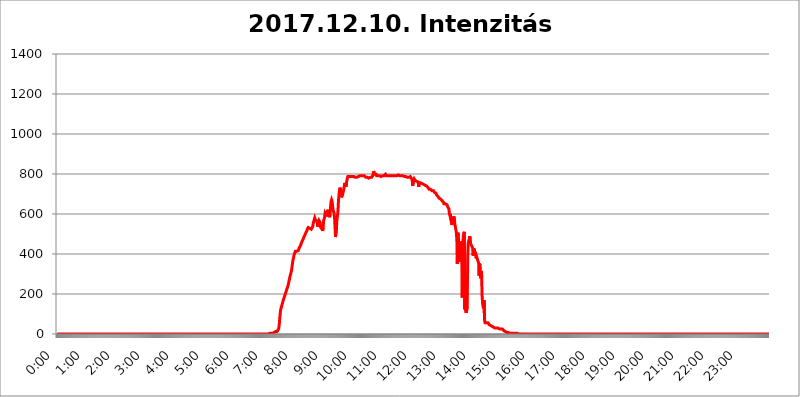
| Category | 2017.12.10. Intenzitás [W/m^2] |
|---|---|
| 0.0 | 0 |
| 0.0006944444444444445 | 0 |
| 0.001388888888888889 | 0 |
| 0.0020833333333333333 | 0 |
| 0.002777777777777778 | 0 |
| 0.003472222222222222 | 0 |
| 0.004166666666666667 | 0 |
| 0.004861111111111111 | 0 |
| 0.005555555555555556 | 0 |
| 0.0062499999999999995 | 0 |
| 0.006944444444444444 | 0 |
| 0.007638888888888889 | 0 |
| 0.008333333333333333 | 0 |
| 0.009027777777777779 | 0 |
| 0.009722222222222222 | 0 |
| 0.010416666666666666 | 0 |
| 0.011111111111111112 | 0 |
| 0.011805555555555555 | 0 |
| 0.012499999999999999 | 0 |
| 0.013194444444444444 | 0 |
| 0.013888888888888888 | 0 |
| 0.014583333333333332 | 0 |
| 0.015277777777777777 | 0 |
| 0.015972222222222224 | 0 |
| 0.016666666666666666 | 0 |
| 0.017361111111111112 | 0 |
| 0.018055555555555557 | 0 |
| 0.01875 | 0 |
| 0.019444444444444445 | 0 |
| 0.02013888888888889 | 0 |
| 0.020833333333333332 | 0 |
| 0.02152777777777778 | 0 |
| 0.022222222222222223 | 0 |
| 0.02291666666666667 | 0 |
| 0.02361111111111111 | 0 |
| 0.024305555555555556 | 0 |
| 0.024999999999999998 | 0 |
| 0.025694444444444447 | 0 |
| 0.02638888888888889 | 0 |
| 0.027083333333333334 | 0 |
| 0.027777777777777776 | 0 |
| 0.02847222222222222 | 0 |
| 0.029166666666666664 | 0 |
| 0.029861111111111113 | 0 |
| 0.030555555555555555 | 0 |
| 0.03125 | 0 |
| 0.03194444444444445 | 0 |
| 0.03263888888888889 | 0 |
| 0.03333333333333333 | 0 |
| 0.034027777777777775 | 0 |
| 0.034722222222222224 | 0 |
| 0.035416666666666666 | 0 |
| 0.036111111111111115 | 0 |
| 0.03680555555555556 | 0 |
| 0.0375 | 0 |
| 0.03819444444444444 | 0 |
| 0.03888888888888889 | 0 |
| 0.03958333333333333 | 0 |
| 0.04027777777777778 | 0 |
| 0.04097222222222222 | 0 |
| 0.041666666666666664 | 0 |
| 0.042361111111111106 | 0 |
| 0.04305555555555556 | 0 |
| 0.043750000000000004 | 0 |
| 0.044444444444444446 | 0 |
| 0.04513888888888889 | 0 |
| 0.04583333333333334 | 0 |
| 0.04652777777777778 | 0 |
| 0.04722222222222222 | 0 |
| 0.04791666666666666 | 0 |
| 0.04861111111111111 | 0 |
| 0.049305555555555554 | 0 |
| 0.049999999999999996 | 0 |
| 0.05069444444444445 | 0 |
| 0.051388888888888894 | 0 |
| 0.052083333333333336 | 0 |
| 0.05277777777777778 | 0 |
| 0.05347222222222222 | 0 |
| 0.05416666666666667 | 0 |
| 0.05486111111111111 | 0 |
| 0.05555555555555555 | 0 |
| 0.05625 | 0 |
| 0.05694444444444444 | 0 |
| 0.057638888888888885 | 0 |
| 0.05833333333333333 | 0 |
| 0.05902777777777778 | 0 |
| 0.059722222222222225 | 0 |
| 0.06041666666666667 | 0 |
| 0.061111111111111116 | 0 |
| 0.06180555555555556 | 0 |
| 0.0625 | 0 |
| 0.06319444444444444 | 0 |
| 0.06388888888888888 | 0 |
| 0.06458333333333334 | 0 |
| 0.06527777777777778 | 0 |
| 0.06597222222222222 | 0 |
| 0.06666666666666667 | 0 |
| 0.06736111111111111 | 0 |
| 0.06805555555555555 | 0 |
| 0.06874999999999999 | 0 |
| 0.06944444444444443 | 0 |
| 0.07013888888888889 | 0 |
| 0.07083333333333333 | 0 |
| 0.07152777777777779 | 0 |
| 0.07222222222222223 | 0 |
| 0.07291666666666667 | 0 |
| 0.07361111111111111 | 0 |
| 0.07430555555555556 | 0 |
| 0.075 | 0 |
| 0.07569444444444444 | 0 |
| 0.0763888888888889 | 0 |
| 0.07708333333333334 | 0 |
| 0.07777777777777778 | 0 |
| 0.07847222222222222 | 0 |
| 0.07916666666666666 | 0 |
| 0.0798611111111111 | 0 |
| 0.08055555555555556 | 0 |
| 0.08125 | 0 |
| 0.08194444444444444 | 0 |
| 0.08263888888888889 | 0 |
| 0.08333333333333333 | 0 |
| 0.08402777777777777 | 0 |
| 0.08472222222222221 | 0 |
| 0.08541666666666665 | 0 |
| 0.08611111111111112 | 0 |
| 0.08680555555555557 | 0 |
| 0.08750000000000001 | 0 |
| 0.08819444444444445 | 0 |
| 0.08888888888888889 | 0 |
| 0.08958333333333333 | 0 |
| 0.09027777777777778 | 0 |
| 0.09097222222222222 | 0 |
| 0.09166666666666667 | 0 |
| 0.09236111111111112 | 0 |
| 0.09305555555555556 | 0 |
| 0.09375 | 0 |
| 0.09444444444444444 | 0 |
| 0.09513888888888888 | 0 |
| 0.09583333333333333 | 0 |
| 0.09652777777777777 | 0 |
| 0.09722222222222222 | 0 |
| 0.09791666666666667 | 0 |
| 0.09861111111111111 | 0 |
| 0.09930555555555555 | 0 |
| 0.09999999999999999 | 0 |
| 0.10069444444444443 | 0 |
| 0.1013888888888889 | 0 |
| 0.10208333333333335 | 0 |
| 0.10277777777777779 | 0 |
| 0.10347222222222223 | 0 |
| 0.10416666666666667 | 0 |
| 0.10486111111111111 | 0 |
| 0.10555555555555556 | 0 |
| 0.10625 | 0 |
| 0.10694444444444444 | 0 |
| 0.1076388888888889 | 0 |
| 0.10833333333333334 | 0 |
| 0.10902777777777778 | 0 |
| 0.10972222222222222 | 0 |
| 0.1111111111111111 | 0 |
| 0.11180555555555556 | 0 |
| 0.11180555555555556 | 0 |
| 0.1125 | 0 |
| 0.11319444444444444 | 0 |
| 0.11388888888888889 | 0 |
| 0.11458333333333333 | 0 |
| 0.11527777777777777 | 0 |
| 0.11597222222222221 | 0 |
| 0.11666666666666665 | 0 |
| 0.1173611111111111 | 0 |
| 0.11805555555555557 | 0 |
| 0.11944444444444445 | 0 |
| 0.12013888888888889 | 0 |
| 0.12083333333333333 | 0 |
| 0.12152777777777778 | 0 |
| 0.12222222222222223 | 0 |
| 0.12291666666666667 | 0 |
| 0.12291666666666667 | 0 |
| 0.12361111111111112 | 0 |
| 0.12430555555555556 | 0 |
| 0.125 | 0 |
| 0.12569444444444444 | 0 |
| 0.12638888888888888 | 0 |
| 0.12708333333333333 | 0 |
| 0.16875 | 0 |
| 0.12847222222222224 | 0 |
| 0.12916666666666668 | 0 |
| 0.12986111111111112 | 0 |
| 0.13055555555555556 | 0 |
| 0.13125 | 0 |
| 0.13194444444444445 | 0 |
| 0.1326388888888889 | 0 |
| 0.13333333333333333 | 0 |
| 0.13402777777777777 | 0 |
| 0.13402777777777777 | 0 |
| 0.13472222222222222 | 0 |
| 0.13541666666666666 | 0 |
| 0.1361111111111111 | 0 |
| 0.13749999999999998 | 0 |
| 0.13819444444444443 | 0 |
| 0.1388888888888889 | 0 |
| 0.13958333333333334 | 0 |
| 0.14027777777777778 | 0 |
| 0.14097222222222222 | 0 |
| 0.14166666666666666 | 0 |
| 0.1423611111111111 | 0 |
| 0.14305555555555557 | 0 |
| 0.14375000000000002 | 0 |
| 0.14444444444444446 | 0 |
| 0.1451388888888889 | 0 |
| 0.1451388888888889 | 0 |
| 0.14652777777777778 | 0 |
| 0.14722222222222223 | 0 |
| 0.14791666666666667 | 0 |
| 0.1486111111111111 | 0 |
| 0.14930555555555555 | 0 |
| 0.15 | 0 |
| 0.15069444444444444 | 0 |
| 0.15138888888888888 | 0 |
| 0.15208333333333332 | 0 |
| 0.15277777777777776 | 0 |
| 0.15347222222222223 | 0 |
| 0.15416666666666667 | 0 |
| 0.15486111111111112 | 0 |
| 0.15555555555555556 | 0 |
| 0.15625 | 0 |
| 0.15694444444444444 | 0 |
| 0.15763888888888888 | 0 |
| 0.15833333333333333 | 0 |
| 0.15902777777777777 | 0 |
| 0.15972222222222224 | 0 |
| 0.16041666666666668 | 0 |
| 0.16111111111111112 | 0 |
| 0.16180555555555556 | 0 |
| 0.1625 | 0 |
| 0.16319444444444445 | 0 |
| 0.1638888888888889 | 0 |
| 0.16458333333333333 | 0 |
| 0.16527777777777777 | 0 |
| 0.16597222222222222 | 0 |
| 0.16666666666666666 | 0 |
| 0.1673611111111111 | 0 |
| 0.16805555555555554 | 0 |
| 0.16874999999999998 | 0 |
| 0.16944444444444443 | 0 |
| 0.17013888888888887 | 0 |
| 0.1708333333333333 | 0 |
| 0.17152777777777775 | 0 |
| 0.17222222222222225 | 0 |
| 0.1729166666666667 | 0 |
| 0.17361111111111113 | 0 |
| 0.17430555555555557 | 0 |
| 0.17500000000000002 | 0 |
| 0.17569444444444446 | 0 |
| 0.1763888888888889 | 0 |
| 0.17708333333333334 | 0 |
| 0.17777777777777778 | 0 |
| 0.17847222222222223 | 0 |
| 0.17916666666666667 | 0 |
| 0.1798611111111111 | 0 |
| 0.18055555555555555 | 0 |
| 0.18125 | 0 |
| 0.18194444444444444 | 0 |
| 0.1826388888888889 | 0 |
| 0.18333333333333335 | 0 |
| 0.1840277777777778 | 0 |
| 0.18472222222222223 | 0 |
| 0.18541666666666667 | 0 |
| 0.18611111111111112 | 0 |
| 0.18680555555555556 | 0 |
| 0.1875 | 0 |
| 0.18819444444444444 | 0 |
| 0.18888888888888888 | 0 |
| 0.18958333333333333 | 0 |
| 0.19027777777777777 | 0 |
| 0.1909722222222222 | 0 |
| 0.19166666666666665 | 0 |
| 0.19236111111111112 | 0 |
| 0.19305555555555554 | 0 |
| 0.19375 | 0 |
| 0.19444444444444445 | 0 |
| 0.1951388888888889 | 0 |
| 0.19583333333333333 | 0 |
| 0.19652777777777777 | 0 |
| 0.19722222222222222 | 0 |
| 0.19791666666666666 | 0 |
| 0.1986111111111111 | 0 |
| 0.19930555555555554 | 0 |
| 0.19999999999999998 | 0 |
| 0.20069444444444443 | 0 |
| 0.20138888888888887 | 0 |
| 0.2020833333333333 | 0 |
| 0.2027777777777778 | 0 |
| 0.2034722222222222 | 0 |
| 0.2041666666666667 | 0 |
| 0.20486111111111113 | 0 |
| 0.20555555555555557 | 0 |
| 0.20625000000000002 | 0 |
| 0.20694444444444446 | 0 |
| 0.2076388888888889 | 0 |
| 0.20833333333333334 | 0 |
| 0.20902777777777778 | 0 |
| 0.20972222222222223 | 0 |
| 0.21041666666666667 | 0 |
| 0.2111111111111111 | 0 |
| 0.21180555555555555 | 0 |
| 0.2125 | 0 |
| 0.21319444444444444 | 0 |
| 0.2138888888888889 | 0 |
| 0.21458333333333335 | 0 |
| 0.2152777777777778 | 0 |
| 0.21597222222222223 | 0 |
| 0.21666666666666667 | 0 |
| 0.21736111111111112 | 0 |
| 0.21805555555555556 | 0 |
| 0.21875 | 0 |
| 0.21944444444444444 | 0 |
| 0.22013888888888888 | 0 |
| 0.22083333333333333 | 0 |
| 0.22152777777777777 | 0 |
| 0.2222222222222222 | 0 |
| 0.22291666666666665 | 0 |
| 0.2236111111111111 | 0 |
| 0.22430555555555556 | 0 |
| 0.225 | 0 |
| 0.22569444444444445 | 0 |
| 0.2263888888888889 | 0 |
| 0.22708333333333333 | 0 |
| 0.22777777777777777 | 0 |
| 0.22847222222222222 | 0 |
| 0.22916666666666666 | 0 |
| 0.2298611111111111 | 0 |
| 0.23055555555555554 | 0 |
| 0.23124999999999998 | 0 |
| 0.23194444444444443 | 0 |
| 0.23263888888888887 | 0 |
| 0.2333333333333333 | 0 |
| 0.2340277777777778 | 0 |
| 0.2347222222222222 | 0 |
| 0.2354166666666667 | 0 |
| 0.23611111111111113 | 0 |
| 0.23680555555555557 | 0 |
| 0.23750000000000002 | 0 |
| 0.23819444444444446 | 0 |
| 0.2388888888888889 | 0 |
| 0.23958333333333334 | 0 |
| 0.24027777777777778 | 0 |
| 0.24097222222222223 | 0 |
| 0.24166666666666667 | 0 |
| 0.2423611111111111 | 0 |
| 0.24305555555555555 | 0 |
| 0.24375 | 0 |
| 0.24444444444444446 | 0 |
| 0.24513888888888888 | 0 |
| 0.24583333333333335 | 0 |
| 0.2465277777777778 | 0 |
| 0.24722222222222223 | 0 |
| 0.24791666666666667 | 0 |
| 0.24861111111111112 | 0 |
| 0.24930555555555556 | 0 |
| 0.25 | 0 |
| 0.25069444444444444 | 0 |
| 0.2513888888888889 | 0 |
| 0.2520833333333333 | 0 |
| 0.25277777777777777 | 0 |
| 0.2534722222222222 | 0 |
| 0.25416666666666665 | 0 |
| 0.2548611111111111 | 0 |
| 0.2555555555555556 | 0 |
| 0.25625000000000003 | 0 |
| 0.2569444444444445 | 0 |
| 0.2576388888888889 | 0 |
| 0.25833333333333336 | 0 |
| 0.2590277777777778 | 0 |
| 0.25972222222222224 | 0 |
| 0.2604166666666667 | 0 |
| 0.2611111111111111 | 0 |
| 0.26180555555555557 | 0 |
| 0.2625 | 0 |
| 0.26319444444444445 | 0 |
| 0.2638888888888889 | 0 |
| 0.26458333333333334 | 0 |
| 0.2652777777777778 | 0 |
| 0.2659722222222222 | 0 |
| 0.26666666666666666 | 0 |
| 0.2673611111111111 | 0 |
| 0.26805555555555555 | 0 |
| 0.26875 | 0 |
| 0.26944444444444443 | 0 |
| 0.2701388888888889 | 0 |
| 0.2708333333333333 | 0 |
| 0.27152777777777776 | 0 |
| 0.2722222222222222 | 0 |
| 0.27291666666666664 | 0 |
| 0.2736111111111111 | 0 |
| 0.2743055555555555 | 0 |
| 0.27499999999999997 | 0 |
| 0.27569444444444446 | 0 |
| 0.27638888888888885 | 0 |
| 0.27708333333333335 | 0 |
| 0.2777777777777778 | 0 |
| 0.27847222222222223 | 0 |
| 0.2791666666666667 | 0 |
| 0.2798611111111111 | 0 |
| 0.28055555555555556 | 0 |
| 0.28125 | 0 |
| 0.28194444444444444 | 0 |
| 0.2826388888888889 | 0 |
| 0.2833333333333333 | 0 |
| 0.28402777777777777 | 0 |
| 0.2847222222222222 | 0 |
| 0.28541666666666665 | 0 |
| 0.28611111111111115 | 0 |
| 0.28680555555555554 | 0 |
| 0.28750000000000003 | 0 |
| 0.2881944444444445 | 0 |
| 0.2888888888888889 | 0 |
| 0.28958333333333336 | 0 |
| 0.2902777777777778 | 0 |
| 0.29097222222222224 | 0 |
| 0.2916666666666667 | 0 |
| 0.2923611111111111 | 0 |
| 0.29305555555555557 | 0 |
| 0.29375 | 0 |
| 0.29444444444444445 | 0 |
| 0.2951388888888889 | 0 |
| 0.29583333333333334 | 0 |
| 0.2965277777777778 | 0 |
| 0.2972222222222222 | 0 |
| 0.29791666666666666 | 3.525 |
| 0.2986111111111111 | 3.525 |
| 0.29930555555555555 | 3.525 |
| 0.3 | 3.525 |
| 0.30069444444444443 | 3.525 |
| 0.3013888888888889 | 3.525 |
| 0.3020833333333333 | 3.525 |
| 0.30277777777777776 | 7.887 |
| 0.3034722222222222 | 7.887 |
| 0.30416666666666664 | 7.887 |
| 0.3048611111111111 | 7.887 |
| 0.3055555555555555 | 7.887 |
| 0.30624999999999997 | 12.257 |
| 0.3069444444444444 | 12.257 |
| 0.3076388888888889 | 12.257 |
| 0.30833333333333335 | 12.257 |
| 0.3090277777777778 | 16.636 |
| 0.30972222222222223 | 16.636 |
| 0.3104166666666667 | 25.419 |
| 0.3111111111111111 | 38.653 |
| 0.31180555555555556 | 65.31 |
| 0.3125 | 96.682 |
| 0.31319444444444444 | 119.235 |
| 0.3138888888888889 | 128.284 |
| 0.3145833333333333 | 137.347 |
| 0.31527777777777777 | 146.423 |
| 0.3159722222222222 | 155.509 |
| 0.31666666666666665 | 164.605 |
| 0.31736111111111115 | 173.709 |
| 0.31805555555555554 | 178.264 |
| 0.31875000000000003 | 187.378 |
| 0.3194444444444445 | 196.497 |
| 0.3201388888888889 | 201.058 |
| 0.32083333333333336 | 210.182 |
| 0.3215277777777778 | 219.309 |
| 0.32222222222222224 | 223.873 |
| 0.3229166666666667 | 233 |
| 0.3236111111111111 | 242.127 |
| 0.32430555555555557 | 251.251 |
| 0.325 | 264.932 |
| 0.32569444444444445 | 274.047 |
| 0.3263888888888889 | 287.709 |
| 0.32708333333333334 | 296.808 |
| 0.3277777777777778 | 305.898 |
| 0.3284722222222222 | 314.98 |
| 0.32916666666666666 | 333.113 |
| 0.3298611111111111 | 351.198 |
| 0.33055555555555555 | 369.23 |
| 0.33125 | 378.224 |
| 0.33194444444444443 | 391.685 |
| 0.3326388888888889 | 400.638 |
| 0.3333333333333333 | 405.108 |
| 0.3340277777777778 | 414.035 |
| 0.3347222222222222 | 414.035 |
| 0.3354166666666667 | 418.492 |
| 0.3361111111111111 | 414.035 |
| 0.3368055555555556 | 409.574 |
| 0.33749999999999997 | 414.035 |
| 0.33819444444444446 | 418.492 |
| 0.33888888888888885 | 422.943 |
| 0.33958333333333335 | 431.833 |
| 0.34027777777777773 | 436.27 |
| 0.34097222222222223 | 440.702 |
| 0.3416666666666666 | 445.129 |
| 0.3423611111111111 | 453.968 |
| 0.3430555555555555 | 458.38 |
| 0.34375 | 467.187 |
| 0.3444444444444445 | 471.582 |
| 0.3451388888888889 | 475.972 |
| 0.3458333333333334 | 484.735 |
| 0.34652777777777777 | 489.108 |
| 0.34722222222222227 | 493.475 |
| 0.34791666666666665 | 497.836 |
| 0.34861111111111115 | 506.542 |
| 0.34930555555555554 | 510.885 |
| 0.35000000000000003 | 515.223 |
| 0.3506944444444444 | 523.88 |
| 0.3513888888888889 | 528.2 |
| 0.3520833333333333 | 532.513 |
| 0.3527777777777778 | 532.513 |
| 0.3534722222222222 | 528.2 |
| 0.3541666666666667 | 528.2 |
| 0.3548611111111111 | 528.2 |
| 0.35555555555555557 | 523.88 |
| 0.35625 | 523.88 |
| 0.35694444444444445 | 523.88 |
| 0.3576388888888889 | 519.555 |
| 0.35833333333333334 | 536.82 |
| 0.3590277777777778 | 553.986 |
| 0.3597222222222222 | 558.261 |
| 0.36041666666666666 | 571.049 |
| 0.3611111111111111 | 579.542 |
| 0.36180555555555555 | 571.049 |
| 0.3625 | 566.793 |
| 0.36319444444444443 | 571.049 |
| 0.3638888888888889 | 566.793 |
| 0.3645833333333333 | 553.986 |
| 0.3652777777777778 | 536.82 |
| 0.3659722222222222 | 532.513 |
| 0.3666666666666667 | 541.121 |
| 0.3673611111111111 | 566.793 |
| 0.3680555555555556 | 571.049 |
| 0.36874999999999997 | 558.261 |
| 0.36944444444444446 | 532.513 |
| 0.37013888888888885 | 528.2 |
| 0.37083333333333335 | 536.82 |
| 0.37152777777777773 | 523.88 |
| 0.37222222222222223 | 515.223 |
| 0.3729166666666666 | 532.513 |
| 0.3736111111111111 | 566.793 |
| 0.3743055555555555 | 575.299 |
| 0.375 | 583.779 |
| 0.3756944444444445 | 604.864 |
| 0.3763888888888889 | 604.864 |
| 0.3770833333333334 | 596.45 |
| 0.37777777777777777 | 588.009 |
| 0.37847222222222227 | 592.233 |
| 0.37916666666666665 | 613.252 |
| 0.37986111111111115 | 621.613 |
| 0.38055555555555554 | 604.864 |
| 0.38125000000000003 | 592.233 |
| 0.3819444444444444 | 583.779 |
| 0.3826388888888889 | 596.45 |
| 0.3833333333333333 | 634.105 |
| 0.3840277777777778 | 663.019 |
| 0.3847222222222222 | 671.22 |
| 0.3854166666666667 | 663.019 |
| 0.3861111111111111 | 642.4 |
| 0.38680555555555557 | 621.613 |
| 0.3875 | 613.252 |
| 0.38819444444444445 | 604.864 |
| 0.3888888888888889 | 583.779 |
| 0.38958333333333334 | 536.82 |
| 0.3902777777777778 | 484.735 |
| 0.3909722222222222 | 489.108 |
| 0.39166666666666666 | 532.513 |
| 0.3923611111111111 | 575.299 |
| 0.39305555555555555 | 592.233 |
| 0.39375 | 617.436 |
| 0.39444444444444443 | 667.123 |
| 0.3951388888888889 | 695.666 |
| 0.3958333333333333 | 719.877 |
| 0.3965277777777778 | 731.896 |
| 0.3972222222222222 | 723.889 |
| 0.3979166666666667 | 707.8 |
| 0.3986111111111111 | 683.473 |
| 0.3993055555555556 | 683.473 |
| 0.39999999999999997 | 695.666 |
| 0.40069444444444446 | 703.762 |
| 0.40138888888888885 | 715.858 |
| 0.40208333333333335 | 727.896 |
| 0.40277777777777773 | 743.859 |
| 0.40347222222222223 | 755.766 |
| 0.4041666666666666 | 743.859 |
| 0.4048611111111111 | 735.89 |
| 0.4055555555555555 | 755.766 |
| 0.40625 | 767.62 |
| 0.4069444444444445 | 779.42 |
| 0.4076388888888889 | 787.258 |
| 0.4083333333333334 | 787.258 |
| 0.40902777777777777 | 787.258 |
| 0.40972222222222227 | 787.258 |
| 0.41041666666666665 | 787.258 |
| 0.41111111111111115 | 787.258 |
| 0.41180555555555554 | 787.258 |
| 0.41250000000000003 | 787.258 |
| 0.4131944444444444 | 787.258 |
| 0.4138888888888889 | 787.258 |
| 0.4145833333333333 | 787.258 |
| 0.4152777777777778 | 787.258 |
| 0.4159722222222222 | 787.258 |
| 0.4166666666666667 | 783.342 |
| 0.4173611111111111 | 783.342 |
| 0.41805555555555557 | 783.342 |
| 0.41875 | 787.258 |
| 0.41944444444444445 | 787.258 |
| 0.4201388888888889 | 783.342 |
| 0.42083333333333334 | 783.342 |
| 0.4215277777777778 | 787.258 |
| 0.4222222222222222 | 787.258 |
| 0.42291666666666666 | 787.258 |
| 0.4236111111111111 | 791.169 |
| 0.42430555555555555 | 791.169 |
| 0.425 | 791.169 |
| 0.42569444444444443 | 791.169 |
| 0.4263888888888889 | 791.169 |
| 0.4270833333333333 | 791.169 |
| 0.4277777777777778 | 791.169 |
| 0.4284722222222222 | 791.169 |
| 0.4291666666666667 | 791.169 |
| 0.4298611111111111 | 787.258 |
| 0.4305555555555556 | 791.169 |
| 0.43124999999999997 | 787.258 |
| 0.43194444444444446 | 787.258 |
| 0.43263888888888885 | 783.342 |
| 0.43333333333333335 | 783.342 |
| 0.43402777777777773 | 779.42 |
| 0.43472222222222223 | 783.342 |
| 0.4354166666666666 | 783.342 |
| 0.4361111111111111 | 779.42 |
| 0.4368055555555555 | 779.42 |
| 0.4375 | 783.342 |
| 0.4381944444444445 | 783.342 |
| 0.4388888888888889 | 783.342 |
| 0.4395833333333334 | 779.42 |
| 0.44027777777777777 | 783.342 |
| 0.44097222222222227 | 783.342 |
| 0.44166666666666665 | 787.258 |
| 0.44236111111111115 | 791.169 |
| 0.44305555555555554 | 798.974 |
| 0.44375000000000003 | 814.519 |
| 0.4444444444444444 | 806.757 |
| 0.4451388888888889 | 798.974 |
| 0.4458333333333333 | 795.074 |
| 0.4465277777777778 | 795.074 |
| 0.4472222222222222 | 798.974 |
| 0.4479166666666667 | 791.169 |
| 0.4486111111111111 | 791.169 |
| 0.44930555555555557 | 795.074 |
| 0.45 | 791.169 |
| 0.45069444444444445 | 791.169 |
| 0.4513888888888889 | 787.258 |
| 0.45208333333333334 | 791.169 |
| 0.4527777777777778 | 791.169 |
| 0.4534722222222222 | 791.169 |
| 0.45416666666666666 | 787.258 |
| 0.4548611111111111 | 791.169 |
| 0.45555555555555555 | 791.169 |
| 0.45625 | 791.169 |
| 0.45694444444444443 | 795.074 |
| 0.4576388888888889 | 791.169 |
| 0.4583333333333333 | 791.169 |
| 0.4590277777777778 | 791.169 |
| 0.4597222222222222 | 795.074 |
| 0.4604166666666667 | 798.974 |
| 0.4611111111111111 | 795.074 |
| 0.4618055555555556 | 791.169 |
| 0.46249999999999997 | 791.169 |
| 0.46319444444444446 | 791.169 |
| 0.46388888888888885 | 791.169 |
| 0.46458333333333335 | 787.258 |
| 0.46527777777777773 | 791.169 |
| 0.46597222222222223 | 791.169 |
| 0.4666666666666666 | 795.074 |
| 0.4673611111111111 | 791.169 |
| 0.4680555555555555 | 791.169 |
| 0.46875 | 791.169 |
| 0.4694444444444445 | 791.169 |
| 0.4701388888888889 | 791.169 |
| 0.4708333333333334 | 791.169 |
| 0.47152777777777777 | 791.169 |
| 0.47222222222222227 | 791.169 |
| 0.47291666666666665 | 791.169 |
| 0.47361111111111115 | 791.169 |
| 0.47430555555555554 | 791.169 |
| 0.47500000000000003 | 791.169 |
| 0.4756944444444444 | 791.169 |
| 0.4763888888888889 | 791.169 |
| 0.4770833333333333 | 791.169 |
| 0.4777777777777778 | 795.074 |
| 0.4784722222222222 | 795.074 |
| 0.4791666666666667 | 791.169 |
| 0.4798611111111111 | 791.169 |
| 0.48055555555555557 | 791.169 |
| 0.48125 | 791.169 |
| 0.48194444444444445 | 791.169 |
| 0.4826388888888889 | 791.169 |
| 0.48333333333333334 | 791.169 |
| 0.4840277777777778 | 791.169 |
| 0.4847222222222222 | 791.169 |
| 0.48541666666666666 | 791.169 |
| 0.4861111111111111 | 791.169 |
| 0.48680555555555555 | 787.258 |
| 0.4875 | 787.258 |
| 0.48819444444444443 | 787.258 |
| 0.4888888888888889 | 787.258 |
| 0.4895833333333333 | 787.258 |
| 0.4902777777777778 | 783.342 |
| 0.4909722222222222 | 783.342 |
| 0.4916666666666667 | 783.342 |
| 0.4923611111111111 | 783.342 |
| 0.4930555555555556 | 783.342 |
| 0.49374999999999997 | 783.342 |
| 0.49444444444444446 | 783.342 |
| 0.49513888888888885 | 787.258 |
| 0.49583333333333335 | 787.258 |
| 0.49652777777777773 | 779.42 |
| 0.49722222222222223 | 779.42 |
| 0.4979166666666666 | 767.62 |
| 0.4986111111111111 | 739.877 |
| 0.4993055555555555 | 775.492 |
| 0.5 | 767.62 |
| 0.5006944444444444 | 775.492 |
| 0.5013888888888889 | 775.492 |
| 0.5020833333333333 | 767.62 |
| 0.5027777777777778 | 767.62 |
| 0.5034722222222222 | 767.62 |
| 0.5041666666666667 | 763.674 |
| 0.5048611111111111 | 759.723 |
| 0.5055555555555555 | 759.723 |
| 0.50625 | 759.723 |
| 0.5069444444444444 | 735.89 |
| 0.5076388888888889 | 755.766 |
| 0.5083333333333333 | 759.723 |
| 0.5090277777777777 | 755.766 |
| 0.5097222222222222 | 755.766 |
| 0.5104166666666666 | 755.766 |
| 0.5111111111111112 | 755.766 |
| 0.5118055555555555 | 751.803 |
| 0.5125000000000001 | 751.803 |
| 0.5131944444444444 | 747.834 |
| 0.513888888888889 | 747.834 |
| 0.5145833333333333 | 747.834 |
| 0.5152777777777778 | 747.834 |
| 0.5159722222222222 | 743.859 |
| 0.5166666666666667 | 743.859 |
| 0.517361111111111 | 739.877 |
| 0.5180555555555556 | 739.877 |
| 0.5187499999999999 | 735.89 |
| 0.5194444444444445 | 735.89 |
| 0.5201388888888888 | 731.896 |
| 0.5208333333333334 | 731.896 |
| 0.5215277777777778 | 723.889 |
| 0.5222222222222223 | 723.889 |
| 0.5229166666666667 | 727.896 |
| 0.5236111111111111 | 723.889 |
| 0.5243055555555556 | 719.877 |
| 0.525 | 719.877 |
| 0.5256944444444445 | 715.858 |
| 0.5263888888888889 | 715.858 |
| 0.5270833333333333 | 715.858 |
| 0.5277777777777778 | 715.858 |
| 0.5284722222222222 | 711.832 |
| 0.5291666666666667 | 707.8 |
| 0.5298611111111111 | 703.762 |
| 0.5305555555555556 | 703.762 |
| 0.53125 | 703.762 |
| 0.5319444444444444 | 695.666 |
| 0.5326388888888889 | 695.666 |
| 0.5333333333333333 | 691.608 |
| 0.5340277777777778 | 687.544 |
| 0.5347222222222222 | 683.473 |
| 0.5354166666666667 | 679.395 |
| 0.5361111111111111 | 679.395 |
| 0.5368055555555555 | 675.311 |
| 0.5375 | 675.311 |
| 0.5381944444444444 | 671.22 |
| 0.5388888888888889 | 671.22 |
| 0.5395833333333333 | 667.123 |
| 0.5402777777777777 | 667.123 |
| 0.5409722222222222 | 663.019 |
| 0.5416666666666666 | 658.909 |
| 0.5423611111111112 | 650.667 |
| 0.5430555555555555 | 650.667 |
| 0.5437500000000001 | 650.667 |
| 0.5444444444444444 | 650.667 |
| 0.545138888888889 | 650.667 |
| 0.5458333333333333 | 646.537 |
| 0.5465277777777778 | 646.537 |
| 0.5472222222222222 | 642.4 |
| 0.5479166666666667 | 634.105 |
| 0.548611111111111 | 634.105 |
| 0.5493055555555556 | 625.784 |
| 0.5499999999999999 | 600.661 |
| 0.5506944444444445 | 592.233 |
| 0.5513888888888888 | 600.661 |
| 0.5520833333333334 | 575.299 |
| 0.5527777777777778 | 558.261 |
| 0.5534722222222223 | 545.416 |
| 0.5541666666666667 | 549.704 |
| 0.5548611111111111 | 566.793 |
| 0.5555555555555556 | 579.542 |
| 0.55625 | 588.009 |
| 0.5569444444444445 | 575.299 |
| 0.5576388888888889 | 549.704 |
| 0.5583333333333333 | 536.82 |
| 0.5590277777777778 | 541.121 |
| 0.5597222222222222 | 506.542 |
| 0.5604166666666667 | 475.972 |
| 0.5611111111111111 | 351.198 |
| 0.5618055555555556 | 506.542 |
| 0.5625 | 489.108 |
| 0.5631944444444444 | 440.702 |
| 0.5638888888888889 | 387.202 |
| 0.5645833333333333 | 360.221 |
| 0.5652777777777778 | 391.685 |
| 0.5659722222222222 | 391.685 |
| 0.5666666666666667 | 462.786 |
| 0.5673611111111111 | 391.685 |
| 0.5680555555555555 | 182.82 |
| 0.56875 | 422.943 |
| 0.5694444444444444 | 489.108 |
| 0.5701388888888889 | 502.192 |
| 0.5708333333333333 | 510.885 |
| 0.5715277777777777 | 123.758 |
| 0.5722222222222222 | 205.62 |
| 0.5729166666666666 | 114.716 |
| 0.5736111111111112 | 105.69 |
| 0.5743055555555555 | 101.184 |
| 0.5750000000000001 | 137.347 |
| 0.5756944444444444 | 387.202 |
| 0.576388888888889 | 453.968 |
| 0.5770833333333333 | 458.38 |
| 0.5777777777777778 | 475.972 |
| 0.5784722222222222 | 489.108 |
| 0.5791666666666667 | 475.972 |
| 0.579861111111111 | 449.551 |
| 0.5805555555555556 | 445.129 |
| 0.5812499999999999 | 445.129 |
| 0.5819444444444445 | 436.27 |
| 0.5826388888888888 | 427.39 |
| 0.5833333333333334 | 391.685 |
| 0.5840277777777778 | 427.39 |
| 0.5847222222222223 | 422.943 |
| 0.5854166666666667 | 414.035 |
| 0.5861111111111111 | 409.574 |
| 0.5868055555555556 | 396.164 |
| 0.5875 | 378.224 |
| 0.5881944444444445 | 387.202 |
| 0.5888888888888889 | 378.224 |
| 0.5895833333333333 | 382.715 |
| 0.5902777777777778 | 373.729 |
| 0.5909722222222222 | 355.712 |
| 0.5916666666666667 | 292.259 |
| 0.5923611111111111 | 351.198 |
| 0.5930555555555556 | 342.162 |
| 0.59375 | 278.603 |
| 0.5944444444444444 | 314.98 |
| 0.5951388888888889 | 305.898 |
| 0.5958333333333333 | 191.937 |
| 0.5965277777777778 | 155.509 |
| 0.5972222222222222 | 137.347 |
| 0.5979166666666667 | 128.284 |
| 0.5986111111111111 | 169.156 |
| 0.5993055555555555 | 69.775 |
| 0.6 | 56.398 |
| 0.6006944444444444 | 56.398 |
| 0.6013888888888889 | 56.398 |
| 0.6020833333333333 | 56.398 |
| 0.6027777777777777 | 60.85 |
| 0.6034722222222222 | 56.398 |
| 0.6041666666666666 | 56.398 |
| 0.6048611111111112 | 51.951 |
| 0.6055555555555555 | 47.511 |
| 0.6062500000000001 | 47.511 |
| 0.6069444444444444 | 47.511 |
| 0.607638888888889 | 43.079 |
| 0.6083333333333333 | 43.079 |
| 0.6090277777777778 | 38.653 |
| 0.6097222222222222 | 38.653 |
| 0.6104166666666667 | 38.653 |
| 0.611111111111111 | 34.234 |
| 0.6118055555555556 | 34.234 |
| 0.6124999999999999 | 34.234 |
| 0.6131944444444445 | 34.234 |
| 0.6138888888888888 | 29.823 |
| 0.6145833333333334 | 29.823 |
| 0.6152777777777778 | 29.823 |
| 0.6159722222222223 | 29.823 |
| 0.6166666666666667 | 29.823 |
| 0.6173611111111111 | 29.823 |
| 0.6180555555555556 | 29.823 |
| 0.61875 | 25.419 |
| 0.6194444444444445 | 25.419 |
| 0.6201388888888889 | 25.419 |
| 0.6208333333333333 | 25.419 |
| 0.6215277777777778 | 25.419 |
| 0.6222222222222222 | 25.419 |
| 0.6229166666666667 | 25.419 |
| 0.6236111111111111 | 25.419 |
| 0.6243055555555556 | 25.419 |
| 0.625 | 21.024 |
| 0.6256944444444444 | 21.024 |
| 0.6263888888888889 | 16.636 |
| 0.6270833333333333 | 12.257 |
| 0.6277777777777778 | 12.257 |
| 0.6284722222222222 | 12.257 |
| 0.6291666666666667 | 12.257 |
| 0.6298611111111111 | 12.257 |
| 0.6305555555555555 | 7.887 |
| 0.63125 | 7.887 |
| 0.6319444444444444 | 7.887 |
| 0.6326388888888889 | 7.887 |
| 0.6333333333333333 | 3.525 |
| 0.6340277777777777 | 3.525 |
| 0.6347222222222222 | 3.525 |
| 0.6354166666666666 | 3.525 |
| 0.6361111111111112 | 3.525 |
| 0.6368055555555555 | 3.525 |
| 0.6375000000000001 | 3.525 |
| 0.6381944444444444 | 3.525 |
| 0.638888888888889 | 3.525 |
| 0.6395833333333333 | 7.887 |
| 0.6402777777777778 | 3.525 |
| 0.6409722222222222 | 3.525 |
| 0.6416666666666667 | 3.525 |
| 0.642361111111111 | 3.525 |
| 0.6430555555555556 | 3.525 |
| 0.6437499999999999 | 3.525 |
| 0.6444444444444445 | 3.525 |
| 0.6451388888888888 | 3.525 |
| 0.6458333333333334 | 0 |
| 0.6465277777777778 | 0 |
| 0.6472222222222223 | 0 |
| 0.6479166666666667 | 0 |
| 0.6486111111111111 | 0 |
| 0.6493055555555556 | 0 |
| 0.65 | 0 |
| 0.6506944444444445 | 0 |
| 0.6513888888888889 | 0 |
| 0.6520833333333333 | 0 |
| 0.6527777777777778 | 0 |
| 0.6534722222222222 | 0 |
| 0.6541666666666667 | 0 |
| 0.6548611111111111 | 0 |
| 0.6555555555555556 | 0 |
| 0.65625 | 0 |
| 0.6569444444444444 | 0 |
| 0.6576388888888889 | 0 |
| 0.6583333333333333 | 0 |
| 0.6590277777777778 | 0 |
| 0.6597222222222222 | 0 |
| 0.6604166666666667 | 0 |
| 0.6611111111111111 | 0 |
| 0.6618055555555555 | 0 |
| 0.6625 | 0 |
| 0.6631944444444444 | 0 |
| 0.6638888888888889 | 0 |
| 0.6645833333333333 | 0 |
| 0.6652777777777777 | 0 |
| 0.6659722222222222 | 0 |
| 0.6666666666666666 | 0 |
| 0.6673611111111111 | 0 |
| 0.6680555555555556 | 0 |
| 0.6687500000000001 | 0 |
| 0.6694444444444444 | 0 |
| 0.6701388888888888 | 0 |
| 0.6708333333333334 | 0 |
| 0.6715277777777778 | 0 |
| 0.6722222222222222 | 0 |
| 0.6729166666666666 | 0 |
| 0.6736111111111112 | 0 |
| 0.6743055555555556 | 0 |
| 0.6749999999999999 | 0 |
| 0.6756944444444444 | 0 |
| 0.6763888888888889 | 0 |
| 0.6770833333333334 | 0 |
| 0.6777777777777777 | 0 |
| 0.6784722222222223 | 0 |
| 0.6791666666666667 | 0 |
| 0.6798611111111111 | 0 |
| 0.6805555555555555 | 0 |
| 0.68125 | 0 |
| 0.6819444444444445 | 0 |
| 0.6826388888888889 | 0 |
| 0.6833333333333332 | 0 |
| 0.6840277777777778 | 0 |
| 0.6847222222222222 | 0 |
| 0.6854166666666667 | 0 |
| 0.686111111111111 | 0 |
| 0.6868055555555556 | 0 |
| 0.6875 | 0 |
| 0.6881944444444444 | 0 |
| 0.688888888888889 | 0 |
| 0.6895833333333333 | 0 |
| 0.6902777777777778 | 0 |
| 0.6909722222222222 | 0 |
| 0.6916666666666668 | 0 |
| 0.6923611111111111 | 0 |
| 0.6930555555555555 | 0 |
| 0.69375 | 0 |
| 0.6944444444444445 | 0 |
| 0.6951388888888889 | 0 |
| 0.6958333333333333 | 0 |
| 0.6965277777777777 | 0 |
| 0.6972222222222223 | 0 |
| 0.6979166666666666 | 0 |
| 0.6986111111111111 | 0 |
| 0.6993055555555556 | 0 |
| 0.7000000000000001 | 0 |
| 0.7006944444444444 | 0 |
| 0.7013888888888888 | 0 |
| 0.7020833333333334 | 0 |
| 0.7027777777777778 | 0 |
| 0.7034722222222222 | 0 |
| 0.7041666666666666 | 0 |
| 0.7048611111111112 | 0 |
| 0.7055555555555556 | 0 |
| 0.7062499999999999 | 0 |
| 0.7069444444444444 | 0 |
| 0.7076388888888889 | 0 |
| 0.7083333333333334 | 0 |
| 0.7090277777777777 | 0 |
| 0.7097222222222223 | 0 |
| 0.7104166666666667 | 0 |
| 0.7111111111111111 | 0 |
| 0.7118055555555555 | 0 |
| 0.7125 | 0 |
| 0.7131944444444445 | 0 |
| 0.7138888888888889 | 0 |
| 0.7145833333333332 | 0 |
| 0.7152777777777778 | 0 |
| 0.7159722222222222 | 0 |
| 0.7166666666666667 | 0 |
| 0.717361111111111 | 0 |
| 0.7180555555555556 | 0 |
| 0.71875 | 0 |
| 0.7194444444444444 | 0 |
| 0.720138888888889 | 0 |
| 0.7208333333333333 | 0 |
| 0.7215277777777778 | 0 |
| 0.7222222222222222 | 0 |
| 0.7229166666666668 | 0 |
| 0.7236111111111111 | 0 |
| 0.7243055555555555 | 0 |
| 0.725 | 0 |
| 0.7256944444444445 | 0 |
| 0.7263888888888889 | 0 |
| 0.7270833333333333 | 0 |
| 0.7277777777777777 | 0 |
| 0.7284722222222223 | 0 |
| 0.7291666666666666 | 0 |
| 0.7298611111111111 | 0 |
| 0.7305555555555556 | 0 |
| 0.7312500000000001 | 0 |
| 0.7319444444444444 | 0 |
| 0.7326388888888888 | 0 |
| 0.7333333333333334 | 0 |
| 0.7340277777777778 | 0 |
| 0.7347222222222222 | 0 |
| 0.7354166666666666 | 0 |
| 0.7361111111111112 | 0 |
| 0.7368055555555556 | 0 |
| 0.7374999999999999 | 0 |
| 0.7381944444444444 | 0 |
| 0.7388888888888889 | 0 |
| 0.7395833333333334 | 0 |
| 0.7402777777777777 | 0 |
| 0.7409722222222223 | 0 |
| 0.7416666666666667 | 0 |
| 0.7423611111111111 | 0 |
| 0.7430555555555555 | 0 |
| 0.74375 | 0 |
| 0.7444444444444445 | 0 |
| 0.7451388888888889 | 0 |
| 0.7458333333333332 | 0 |
| 0.7465277777777778 | 0 |
| 0.7472222222222222 | 0 |
| 0.7479166666666667 | 0 |
| 0.748611111111111 | 0 |
| 0.7493055555555556 | 0 |
| 0.75 | 0 |
| 0.7506944444444444 | 0 |
| 0.751388888888889 | 0 |
| 0.7520833333333333 | 0 |
| 0.7527777777777778 | 0 |
| 0.7534722222222222 | 0 |
| 0.7541666666666668 | 0 |
| 0.7548611111111111 | 0 |
| 0.7555555555555555 | 0 |
| 0.75625 | 0 |
| 0.7569444444444445 | 0 |
| 0.7576388888888889 | 0 |
| 0.7583333333333333 | 0 |
| 0.7590277777777777 | 0 |
| 0.7597222222222223 | 0 |
| 0.7604166666666666 | 0 |
| 0.7611111111111111 | 0 |
| 0.7618055555555556 | 0 |
| 0.7625000000000001 | 0 |
| 0.7631944444444444 | 0 |
| 0.7638888888888888 | 0 |
| 0.7645833333333334 | 0 |
| 0.7652777777777778 | 0 |
| 0.7659722222222222 | 0 |
| 0.7666666666666666 | 0 |
| 0.7673611111111112 | 0 |
| 0.7680555555555556 | 0 |
| 0.7687499999999999 | 0 |
| 0.7694444444444444 | 0 |
| 0.7701388888888889 | 0 |
| 0.7708333333333334 | 0 |
| 0.7715277777777777 | 0 |
| 0.7722222222222223 | 0 |
| 0.7729166666666667 | 0 |
| 0.7736111111111111 | 0 |
| 0.7743055555555555 | 0 |
| 0.775 | 0 |
| 0.7756944444444445 | 0 |
| 0.7763888888888889 | 0 |
| 0.7770833333333332 | 0 |
| 0.7777777777777778 | 0 |
| 0.7784722222222222 | 0 |
| 0.7791666666666667 | 0 |
| 0.779861111111111 | 0 |
| 0.7805555555555556 | 0 |
| 0.78125 | 0 |
| 0.7819444444444444 | 0 |
| 0.782638888888889 | 0 |
| 0.7833333333333333 | 0 |
| 0.7840277777777778 | 0 |
| 0.7847222222222222 | 0 |
| 0.7854166666666668 | 0 |
| 0.7861111111111111 | 0 |
| 0.7868055555555555 | 0 |
| 0.7875 | 0 |
| 0.7881944444444445 | 0 |
| 0.7888888888888889 | 0 |
| 0.7895833333333333 | 0 |
| 0.7902777777777777 | 0 |
| 0.7909722222222223 | 0 |
| 0.7916666666666666 | 0 |
| 0.7923611111111111 | 0 |
| 0.7930555555555556 | 0 |
| 0.7937500000000001 | 0 |
| 0.7944444444444444 | 0 |
| 0.7951388888888888 | 0 |
| 0.7958333333333334 | 0 |
| 0.7965277777777778 | 0 |
| 0.7972222222222222 | 0 |
| 0.7979166666666666 | 0 |
| 0.7986111111111112 | 0 |
| 0.7993055555555556 | 0 |
| 0.7999999999999999 | 0 |
| 0.8006944444444444 | 0 |
| 0.8013888888888889 | 0 |
| 0.8020833333333334 | 0 |
| 0.8027777777777777 | 0 |
| 0.8034722222222223 | 0 |
| 0.8041666666666667 | 0 |
| 0.8048611111111111 | 0 |
| 0.8055555555555555 | 0 |
| 0.80625 | 0 |
| 0.8069444444444445 | 0 |
| 0.8076388888888889 | 0 |
| 0.8083333333333332 | 0 |
| 0.8090277777777778 | 0 |
| 0.8097222222222222 | 0 |
| 0.8104166666666667 | 0 |
| 0.811111111111111 | 0 |
| 0.8118055555555556 | 0 |
| 0.8125 | 0 |
| 0.8131944444444444 | 0 |
| 0.813888888888889 | 0 |
| 0.8145833333333333 | 0 |
| 0.8152777777777778 | 0 |
| 0.8159722222222222 | 0 |
| 0.8166666666666668 | 0 |
| 0.8173611111111111 | 0 |
| 0.8180555555555555 | 0 |
| 0.81875 | 0 |
| 0.8194444444444445 | 0 |
| 0.8201388888888889 | 0 |
| 0.8208333333333333 | 0 |
| 0.8215277777777777 | 0 |
| 0.8222222222222223 | 0 |
| 0.8229166666666666 | 0 |
| 0.8236111111111111 | 0 |
| 0.8243055555555556 | 0 |
| 0.8250000000000001 | 0 |
| 0.8256944444444444 | 0 |
| 0.8263888888888888 | 0 |
| 0.8270833333333334 | 0 |
| 0.8277777777777778 | 0 |
| 0.8284722222222222 | 0 |
| 0.8291666666666666 | 0 |
| 0.8298611111111112 | 0 |
| 0.8305555555555556 | 0 |
| 0.8312499999999999 | 0 |
| 0.8319444444444444 | 0 |
| 0.8326388888888889 | 0 |
| 0.8333333333333334 | 0 |
| 0.8340277777777777 | 0 |
| 0.8347222222222223 | 0 |
| 0.8354166666666667 | 0 |
| 0.8361111111111111 | 0 |
| 0.8368055555555555 | 0 |
| 0.8375 | 0 |
| 0.8381944444444445 | 0 |
| 0.8388888888888889 | 0 |
| 0.8395833333333332 | 0 |
| 0.8402777777777778 | 0 |
| 0.8409722222222222 | 0 |
| 0.8416666666666667 | 0 |
| 0.842361111111111 | 0 |
| 0.8430555555555556 | 0 |
| 0.84375 | 0 |
| 0.8444444444444444 | 0 |
| 0.845138888888889 | 0 |
| 0.8458333333333333 | 0 |
| 0.8465277777777778 | 0 |
| 0.8472222222222222 | 0 |
| 0.8479166666666668 | 0 |
| 0.8486111111111111 | 0 |
| 0.8493055555555555 | 0 |
| 0.85 | 0 |
| 0.8506944444444445 | 0 |
| 0.8513888888888889 | 0 |
| 0.8520833333333333 | 0 |
| 0.8527777777777777 | 0 |
| 0.8534722222222223 | 0 |
| 0.8541666666666666 | 0 |
| 0.8548611111111111 | 0 |
| 0.8555555555555556 | 0 |
| 0.8562500000000001 | 0 |
| 0.8569444444444444 | 0 |
| 0.8576388888888888 | 0 |
| 0.8583333333333334 | 0 |
| 0.8590277777777778 | 0 |
| 0.8597222222222222 | 0 |
| 0.8604166666666666 | 0 |
| 0.8611111111111112 | 0 |
| 0.8618055555555556 | 0 |
| 0.8624999999999999 | 0 |
| 0.8631944444444444 | 0 |
| 0.8638888888888889 | 0 |
| 0.8645833333333334 | 0 |
| 0.8652777777777777 | 0 |
| 0.8659722222222223 | 0 |
| 0.8666666666666667 | 0 |
| 0.8673611111111111 | 0 |
| 0.8680555555555555 | 0 |
| 0.86875 | 0 |
| 0.8694444444444445 | 0 |
| 0.8701388888888889 | 0 |
| 0.8708333333333332 | 0 |
| 0.8715277777777778 | 0 |
| 0.8722222222222222 | 0 |
| 0.8729166666666667 | 0 |
| 0.873611111111111 | 0 |
| 0.8743055555555556 | 0 |
| 0.875 | 0 |
| 0.8756944444444444 | 0 |
| 0.876388888888889 | 0 |
| 0.8770833333333333 | 0 |
| 0.8777777777777778 | 0 |
| 0.8784722222222222 | 0 |
| 0.8791666666666668 | 0 |
| 0.8798611111111111 | 0 |
| 0.8805555555555555 | 0 |
| 0.88125 | 0 |
| 0.8819444444444445 | 0 |
| 0.8826388888888889 | 0 |
| 0.8833333333333333 | 0 |
| 0.8840277777777777 | 0 |
| 0.8847222222222223 | 0 |
| 0.8854166666666666 | 0 |
| 0.8861111111111111 | 0 |
| 0.8868055555555556 | 0 |
| 0.8875000000000001 | 0 |
| 0.8881944444444444 | 0 |
| 0.8888888888888888 | 0 |
| 0.8895833333333334 | 0 |
| 0.8902777777777778 | 0 |
| 0.8909722222222222 | 0 |
| 0.8916666666666666 | 0 |
| 0.8923611111111112 | 0 |
| 0.8930555555555556 | 0 |
| 0.8937499999999999 | 0 |
| 0.8944444444444444 | 0 |
| 0.8951388888888889 | 0 |
| 0.8958333333333334 | 0 |
| 0.8965277777777777 | 0 |
| 0.8972222222222223 | 0 |
| 0.8979166666666667 | 0 |
| 0.8986111111111111 | 0 |
| 0.8993055555555555 | 0 |
| 0.9 | 0 |
| 0.9006944444444445 | 0 |
| 0.9013888888888889 | 0 |
| 0.9020833333333332 | 0 |
| 0.9027777777777778 | 0 |
| 0.9034722222222222 | 0 |
| 0.9041666666666667 | 0 |
| 0.904861111111111 | 0 |
| 0.9055555555555556 | 0 |
| 0.90625 | 0 |
| 0.9069444444444444 | 0 |
| 0.907638888888889 | 0 |
| 0.9083333333333333 | 0 |
| 0.9090277777777778 | 0 |
| 0.9097222222222222 | 0 |
| 0.9104166666666668 | 0 |
| 0.9111111111111111 | 0 |
| 0.9118055555555555 | 0 |
| 0.9125 | 0 |
| 0.9131944444444445 | 0 |
| 0.9138888888888889 | 0 |
| 0.9145833333333333 | 0 |
| 0.9152777777777777 | 0 |
| 0.9159722222222223 | 0 |
| 0.9166666666666666 | 0 |
| 0.9173611111111111 | 0 |
| 0.9180555555555556 | 0 |
| 0.9187500000000001 | 0 |
| 0.9194444444444444 | 0 |
| 0.9201388888888888 | 0 |
| 0.9208333333333334 | 0 |
| 0.9215277777777778 | 0 |
| 0.9222222222222222 | 0 |
| 0.9229166666666666 | 0 |
| 0.9236111111111112 | 0 |
| 0.9243055555555556 | 0 |
| 0.9249999999999999 | 0 |
| 0.9256944444444444 | 0 |
| 0.9263888888888889 | 0 |
| 0.9270833333333334 | 0 |
| 0.9277777777777777 | 0 |
| 0.9284722222222223 | 0 |
| 0.9291666666666667 | 0 |
| 0.9298611111111111 | 0 |
| 0.9305555555555555 | 0 |
| 0.93125 | 0 |
| 0.9319444444444445 | 0 |
| 0.9326388888888889 | 0 |
| 0.9333333333333332 | 0 |
| 0.9340277777777778 | 0 |
| 0.9347222222222222 | 0 |
| 0.9354166666666667 | 0 |
| 0.936111111111111 | 0 |
| 0.9368055555555556 | 0 |
| 0.9375 | 0 |
| 0.9381944444444444 | 0 |
| 0.938888888888889 | 0 |
| 0.9395833333333333 | 0 |
| 0.9402777777777778 | 0 |
| 0.9409722222222222 | 0 |
| 0.9416666666666668 | 0 |
| 0.9423611111111111 | 0 |
| 0.9430555555555555 | 0 |
| 0.94375 | 0 |
| 0.9444444444444445 | 0 |
| 0.9451388888888889 | 0 |
| 0.9458333333333333 | 0 |
| 0.9465277777777777 | 0 |
| 0.9472222222222223 | 0 |
| 0.9479166666666666 | 0 |
| 0.9486111111111111 | 0 |
| 0.9493055555555556 | 0 |
| 0.9500000000000001 | 0 |
| 0.9506944444444444 | 0 |
| 0.9513888888888888 | 0 |
| 0.9520833333333334 | 0 |
| 0.9527777777777778 | 0 |
| 0.9534722222222222 | 0 |
| 0.9541666666666666 | 0 |
| 0.9548611111111112 | 0 |
| 0.9555555555555556 | 0 |
| 0.9562499999999999 | 0 |
| 0.9569444444444444 | 0 |
| 0.9576388888888889 | 0 |
| 0.9583333333333334 | 0 |
| 0.9590277777777777 | 0 |
| 0.9597222222222223 | 0 |
| 0.9604166666666667 | 0 |
| 0.9611111111111111 | 0 |
| 0.9618055555555555 | 0 |
| 0.9625 | 0 |
| 0.9631944444444445 | 0 |
| 0.9638888888888889 | 0 |
| 0.9645833333333332 | 0 |
| 0.9652777777777778 | 0 |
| 0.9659722222222222 | 0 |
| 0.9666666666666667 | 0 |
| 0.967361111111111 | 0 |
| 0.9680555555555556 | 0 |
| 0.96875 | 0 |
| 0.9694444444444444 | 0 |
| 0.970138888888889 | 0 |
| 0.9708333333333333 | 0 |
| 0.9715277777777778 | 0 |
| 0.9722222222222222 | 0 |
| 0.9729166666666668 | 0 |
| 0.9736111111111111 | 0 |
| 0.9743055555555555 | 0 |
| 0.975 | 0 |
| 0.9756944444444445 | 0 |
| 0.9763888888888889 | 0 |
| 0.9770833333333333 | 0 |
| 0.9777777777777777 | 0 |
| 0.9784722222222223 | 0 |
| 0.9791666666666666 | 0 |
| 0.9798611111111111 | 0 |
| 0.9805555555555556 | 0 |
| 0.9812500000000001 | 0 |
| 0.9819444444444444 | 0 |
| 0.9826388888888888 | 0 |
| 0.9833333333333334 | 0 |
| 0.9840277777777778 | 0 |
| 0.9847222222222222 | 0 |
| 0.9854166666666666 | 0 |
| 0.9861111111111112 | 0 |
| 0.9868055555555556 | 0 |
| 0.9874999999999999 | 0 |
| 0.9881944444444444 | 0 |
| 0.9888888888888889 | 0 |
| 0.9895833333333334 | 0 |
| 0.9902777777777777 | 0 |
| 0.9909722222222223 | 0 |
| 0.9916666666666667 | 0 |
| 0.9923611111111111 | 0 |
| 0.9930555555555555 | 0 |
| 0.99375 | 0 |
| 0.9944444444444445 | 0 |
| 0.9951388888888889 | 0 |
| 0.9958333333333332 | 0 |
| 0.9965277777777778 | 0 |
| 0.9972222222222222 | 0 |
| 0.9979166666666667 | 0 |
| 0.998611111111111 | 0 |
| 0.9993055555555556 | 0 |